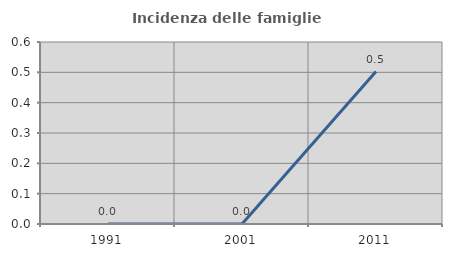
| Category | Incidenza delle famiglie numerose |
|---|---|
| 1991.0 | 0 |
| 2001.0 | 0 |
| 2011.0 | 0.503 |